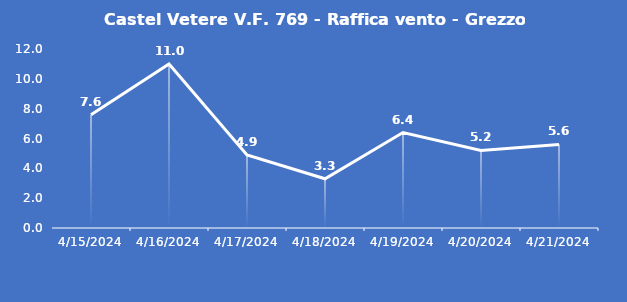
| Category | Castel Vetere V.F. 769 - Raffica vento - Grezzo (m/s) |
|---|---|
| 4/15/24 | 7.6 |
| 4/16/24 | 11 |
| 4/17/24 | 4.9 |
| 4/18/24 | 3.3 |
| 4/19/24 | 6.4 |
| 4/20/24 | 5.2 |
| 4/21/24 | 5.6 |